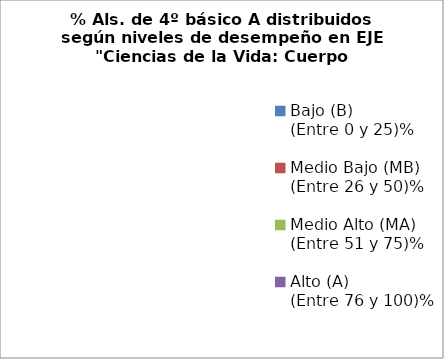
| Category | Series 0 |
|---|---|
| Bajo (B)                  (Entre 0 y 25)% | 0 |
| Medio Bajo (MB)   (Entre 26 y 50)% | 0 |
| Medio Alto (MA)    (Entre 51 y 75)% | 0 |
| Alto (A)                 (Entre 76 y 100)% | 0 |